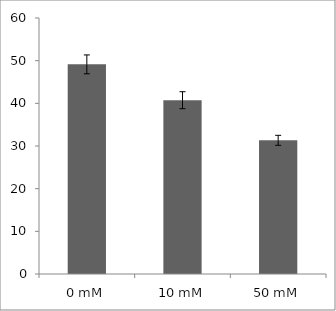
| Category | Series 0 |
|---|---|
| 0 mM | 49.133 |
| 10 mM | 40.733 |
| 50 mM | 31.333 |